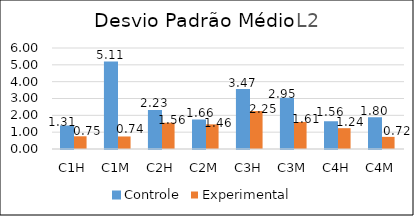
| Category | Controle | Experimental  |
|---|---|---|
| C1H | 1.31 | 0.755 |
| C1M | 5.109 | 0.744 |
| C2H | 2.231 | 1.561 |
| C2M | 1.658 | 1.465 |
| C3H | 3.474 | 2.255 |
| C3M | 2.948 | 1.606 |
| C4H | 1.56 | 1.236 |
| C4M | 1.796 | 0.721 |